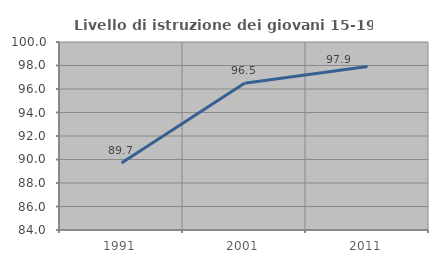
| Category | Livello di istruzione dei giovani 15-19 anni |
|---|---|
| 1991.0 | 89.706 |
| 2001.0 | 96.491 |
| 2011.0 | 97.917 |